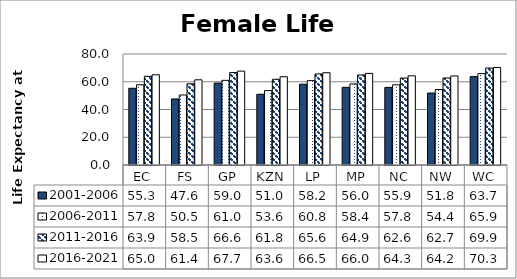
| Category | 2001-2006 | 2006-2011 | 2011-2016 | 2016-2021 |
|---|---|---|---|---|
| EC | 55.288 | 57.821 | 63.926 | 65.028 |
| FS | 47.603 | 50.452 | 58.533 | 61.399 |
| GP | 59.024 | 61.014 | 66.6 | 67.677 |
| KZN | 50.98 | 53.618 | 61.802 | 63.601 |
| LP | 58.241 | 60.804 | 65.631 | 66.507 |
| MP | 55.981 | 58.419 | 64.91 | 66.036 |
| NC | 55.923 | 57.789 | 62.639 | 64.274 |
| NW | 51.843 | 54.405 | 62.706 | 64.183 |
| WC | 63.692 | 65.865 | 69.892 | 70.276 |